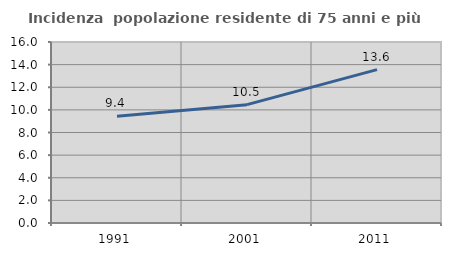
| Category | Incidenza  popolazione residente di 75 anni e più |
|---|---|
| 1991.0 | 9.428 |
| 2001.0 | 10.461 |
| 2011.0 | 13.561 |